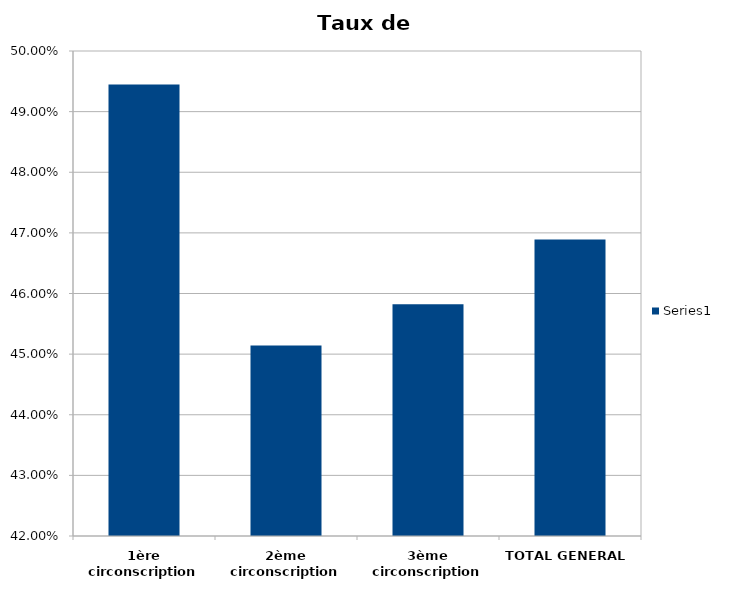
| Category | Series 0 | Series 1 | Series 2 |
|---|---|---|---|
| 1ère circonscription | 0.494 |  |  |
| 2ème circonscription | 0.451 |  |  |
| 3ème circonscription | 0.458 |  |  |
| TOTAL GENERAL | 0.469 |  |  |